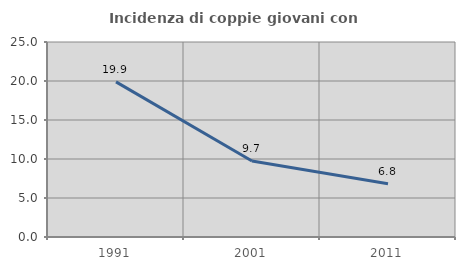
| Category | Incidenza di coppie giovani con figli |
|---|---|
| 1991.0 | 19.886 |
| 2001.0 | 9.744 |
| 2011.0 | 6.818 |